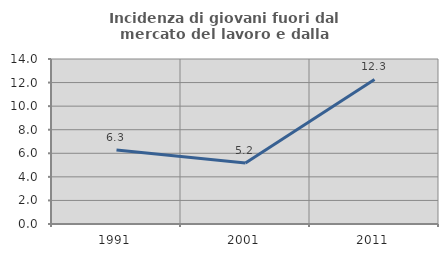
| Category | Incidenza di giovani fuori dal mercato del lavoro e dalla formazione  |
|---|---|
| 1991.0 | 6.283 |
| 2001.0 | 5.172 |
| 2011.0 | 12.264 |